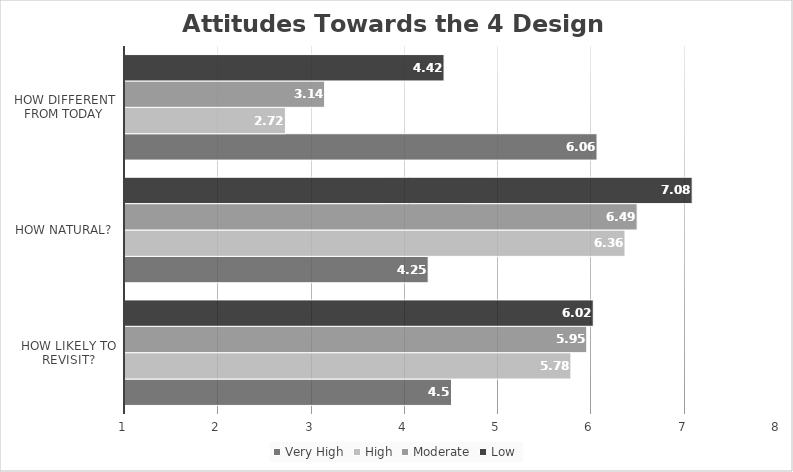
| Category | Very High | High | Moderate | Low |
|---|---|---|---|---|
| How Likely to Revisit? | 4.5 | 5.78 | 5.95 | 6.02 |
| How Natural? | 4.25 | 6.36 | 6.49 | 7.08 |
| How Different from Today | 6.06 | 2.72 | 3.14 | 4.42 |